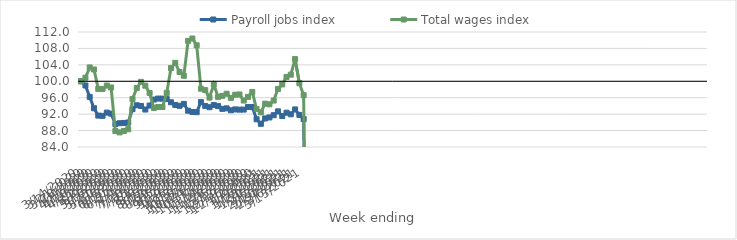
| Category | Payroll jobs index | Total wages index |
|---|---|---|
| 14/03/2020 | 100 | 100 |
| 21/03/2020 | 98.983 | 100.874 |
| 28/03/2020 | 96.199 | 103.375 |
| 04/04/2020 | 93.431 | 102.877 |
| 11/04/2020 | 91.65 | 98.155 |
| 18/04/2020 | 91.588 | 98.128 |
| 25/04/2020 | 92.376 | 98.956 |
| 02/05/2020 | 92.13 | 98.497 |
| 09/05/2020 | 89.58 | 87.881 |
| 16/05/2020 | 89.788 | 87.553 |
| 23/05/2020 | 89.855 | 87.906 |
| 30/05/2020 | 89.961 | 88.318 |
| 06/06/2020 | 93.215 | 95.693 |
| 13/06/2020 | 94.168 | 98.356 |
| 20/06/2020 | 93.988 | 99.861 |
| 27/06/2020 | 93.122 | 98.93 |
| 04/07/2020 | 94.094 | 97.152 |
| 11/07/2020 | 95.554 | 93.518 |
| 18/07/2020 | 95.794 | 93.731 |
| 25/07/2020 | 95.774 | 93.735 |
| 01/08/2020 | 95.678 | 97.174 |
| 08/08/2020 | 94.887 | 103.212 |
| 15/08/2020 | 94.237 | 104.486 |
| 22/08/2020 | 94.023 | 102.262 |
| 29/08/2020 | 94.498 | 101.344 |
| 05/09/2020 | 92.837 | 109.841 |
| 12/09/2020 | 92.534 | 110.416 |
| 19/09/2020 | 92.478 | 108.761 |
| 26/09/2020 | 94.931 | 98.196 |
| 03/10/2020 | 94.004 | 97.842 |
| 10/10/2020 | 93.69 | 96.035 |
| 17/10/2020 | 94.218 | 99.247 |
| 24/10/2020 | 93.954 | 96.195 |
| 31/10/2020 | 93.292 | 96.453 |
| 07/11/2020 | 93.408 | 96.97 |
| 14/11/2020 | 92.934 | 95.962 |
| 21/11/2020 | 93.151 | 96.731 |
| 28/11/2020 | 93.098 | 96.791 |
| 05/12/2020 | 93.106 | 95.313 |
| 12/12/2020 | 93.728 | 96.206 |
| 19/12/2020 | 93.725 | 97.412 |
| 26/12/2020 | 90.747 | 93.224 |
| 02/01/2021 | 89.645 | 92.432 |
| 09/01/2021 | 90.955 | 94.555 |
| 16/01/2021 | 91.196 | 94.39 |
| 23/01/2021 | 91.74 | 95.308 |
| 30/01/2021 | 92.675 | 98.143 |
| 06/02/2021 | 91.547 | 99.24 |
| 13/02/2021 | 92.351 | 101.062 |
| 20/02/2021 | 91.965 | 101.616 |
| 27/02/2021 | 93.149 | 105.406 |
| 06/03/2021 | 91.817 | 99.545 |
| 13/03/2021 | 90.793 | 96.61 |